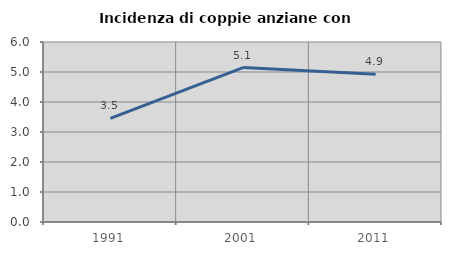
| Category | Incidenza di coppie anziane con figli |
|---|---|
| 1991.0 | 3.456 |
| 2001.0 | 5.146 |
| 2011.0 | 4.921 |